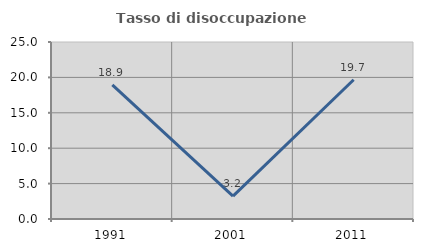
| Category | Tasso di disoccupazione giovanile  |
|---|---|
| 1991.0 | 18.935 |
| 2001.0 | 3.226 |
| 2011.0 | 19.672 |